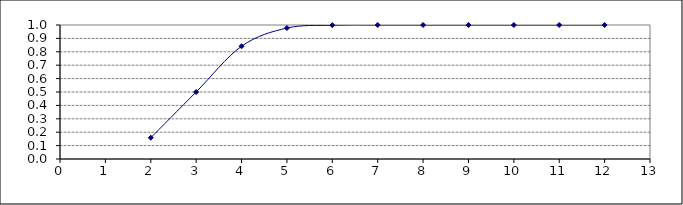
| Category | Series 0 |
|---|---|
| 2.0 | 0.159 |
| 3.0 | 0.5 |
| 4.0 | 0.841 |
| 5.0 | 0.977 |
| 6.0 | 0.999 |
| 7.0 | 1 |
| 8.0 | 1 |
| 9.0 | 1 |
| 10.0 | 1 |
| 11.0 | 1 |
| 12.0 | 1 |